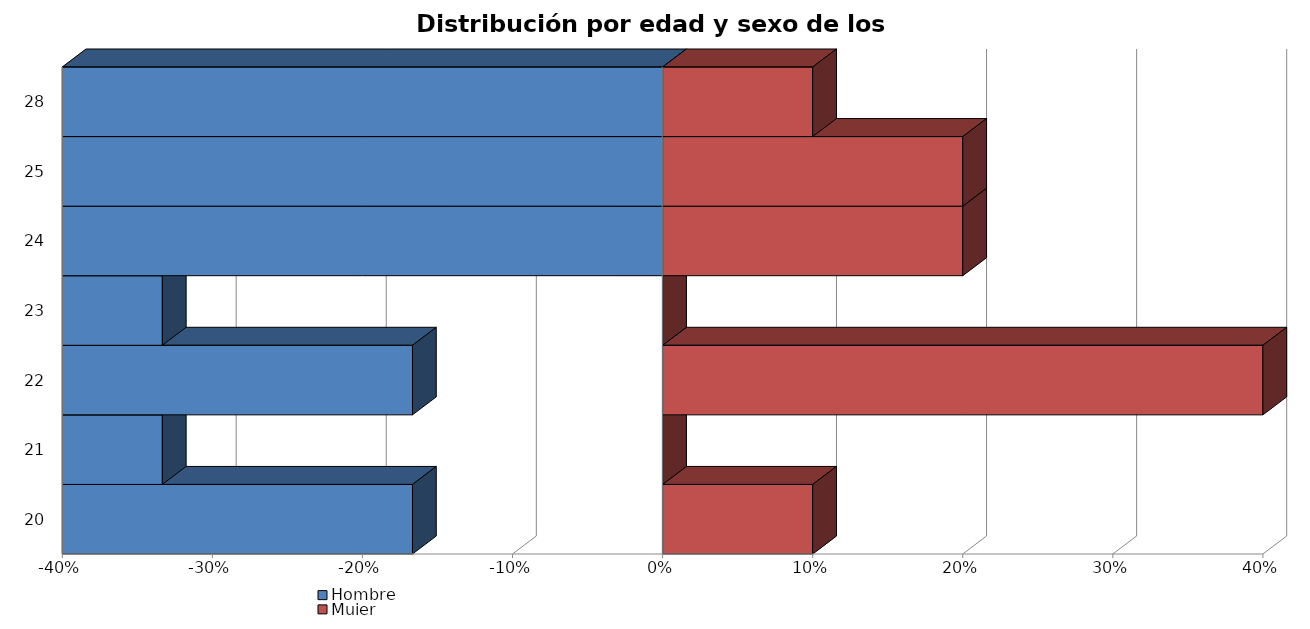
| Category | Hombre | Mujer |
|---|---|---|
| 20 | -0.167 | 0.1 |
| 21 | -0.333 | 0 |
| 22 | -0.167 | 0.4 |
| 23 | -0.333 | 0 |
| 24 | 0 | 0.2 |
| 25 | 0 | 0.2 |
| 28 | 0 | 0.1 |